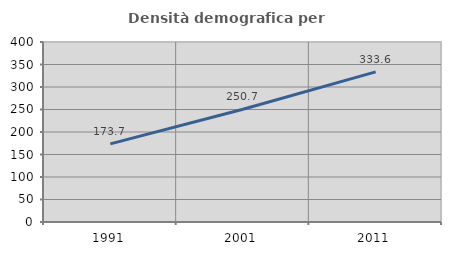
| Category | Densità demografica |
|---|---|
| 1991.0 | 173.671 |
| 2001.0 | 250.683 |
| 2011.0 | 333.567 |